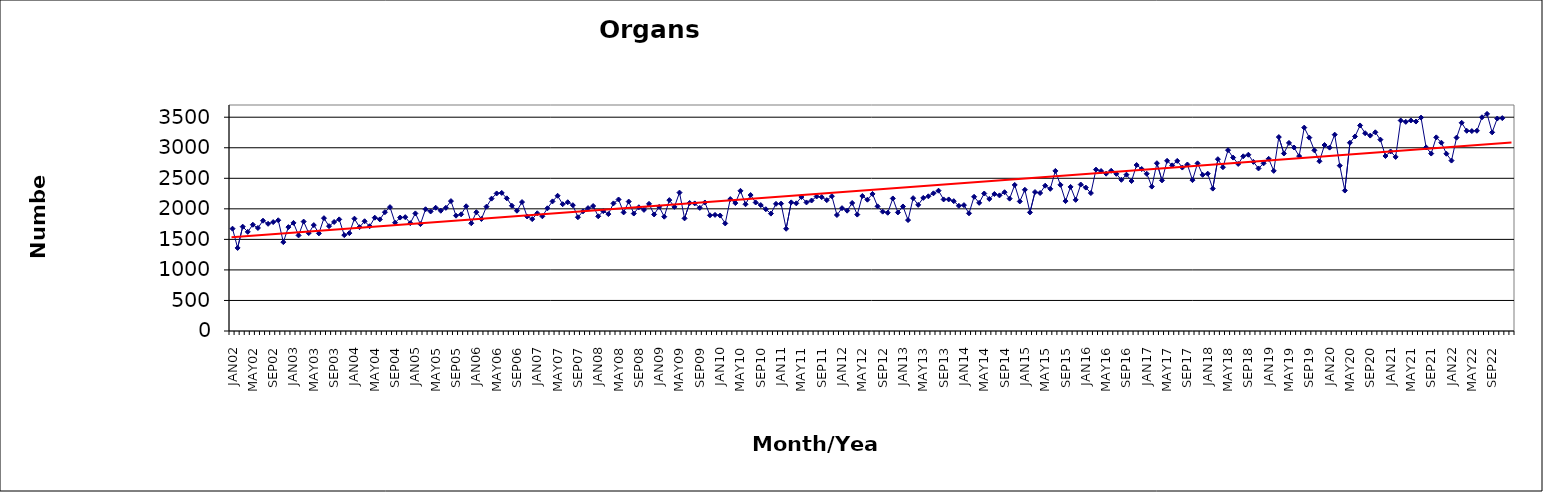
| Category | Series 0 |
|---|---|
| JAN02 | 1675 |
| FEB02 | 1360 |
| MAR02 | 1708 |
| APR02 | 1623 |
| MAY02 | 1740 |
| JUN02 | 1687 |
| JUL02 | 1806 |
| AUG02 | 1755 |
| SEP02 | 1783 |
| OCT02 | 1813 |
| NOV02 | 1455 |
| DEC02 | 1701 |
| JAN03 | 1770 |
| FEB03 | 1565 |
| MAR03 | 1791 |
| APR03 | 1603 |
| MAY03 | 1734 |
| JUN03 | 1598 |
| JUL03 | 1847 |
| AUG03 | 1716 |
| SEP03 | 1785 |
| OCT03 | 1827 |
| NOV03 | 1570 |
| DEC03 | 1602 |
| JAN04 | 1839 |
| FEB04 | 1700 |
| MAR04 | 1797 |
| APR04 | 1715 |
| MAY04 | 1855 |
| JUN04 | 1827 |
| JUL04 | 1945 |
| AUG04 | 2028 |
| SEP04 | 1773 |
| OCT04 | 1857 |
| NOV04 | 1864 |
| DEC04 | 1766 |
| JAN05 | 1925 |
| FEB05 | 1750 |
| MAR05 | 1993 |
| APR05 | 1957 |
| MAY05 | 2018 |
| JUN05 | 1969 |
| JUL05 | 2016 |
| AUG05 | 2127 |
| SEP05 | 1888 |
| OCT05 | 1910 |
| NOV05 | 2042 |
| DEC05 | 1764 |
| JAN06 | 1945 |
| FEB06 | 1834 |
| MAR06 | 2035 |
| APR06 | 2167 |
| MAY06 | 2252 |
| JUN06 | 2261 |
| JUL06 | 2172 |
| AUG06 | 2051 |
| SEP06 | 1969 |
| OCT06 | 2111 |
| NOV06 | 1875 |
| DEC06 | 1832 |
| JAN07 | 1927 |
| FEB07 | 1878 |
| MAR07 | 2009 |
| APR07 | 2122 |
| MAY07 | 2214 |
| JUN07 | 2076 |
| JUL07 | 2108 |
| AUG07 | 2060 |
| SEP07 | 1863 |
| OCT07 | 1959 |
| NOV07 | 2012 |
| DEC07 | 2046 |
| JAN08 | 1878 |
| FEB08 | 1962 |
| MAR08 | 1914 |
| APR08 | 2089 |
| MAY08 | 2153 |
| JUN08 | 1942 |
| JUL08 | 2119 |
| AUG08 | 1923 |
| SEP08 | 2026 |
| OCT08 | 1983 |
| NOV08 | 2082 |
| DEC08 | 1908 |
| JAN09 | 2033 |
| FEB09 | 1871 |
| MAR09 | 2143 |
| APR09 | 2032 |
| MAY09 | 2266 |
| JUN09 | 1844 |
| JUL09 | 2096 |
| AUG09 | 2089 |
| SEP09 | 2016 |
| OCT09 | 2104 |
| NOV09 | 1894 |
| DEC09 | 1901 |
| JAN10 | 1890 |
| FEB10 | 1761 |
| MAR10 | 2160 |
| APR10 | 2094 |
| MAY10 | 2295 |
| JUN10 | 2075 |
| JUL10 | 2226 |
| AUG10 | 2104 |
| SEP10 | 2062 |
| OCT10 | 1994 |
| NOV10 | 1922 |
| DEC10 | 2082 |
| JAN11 | 2085 |
| FEB11 | 1674 |
| MAR11 | 2106 |
| APR11 | 2090 |
| MAY11 | 2194 |
| JUN11 | 2105 |
| JUL11 | 2136 |
| AUG11 | 2202 |
| SEP11 | 2192 |
| OCT11 | 2142 |
| NOV11 | 2207 |
| DEC11 | 1899 |
| JAN12 | 2011 |
| FEB12 | 1970 |
| MAR12 | 2096 |
| APR12 | 1906 |
| MAY12 | 2210 |
| JUN12 | 2150 |
| JUL12 | 2244 |
| AUG12 | 2041 |
| SEP12 | 1954 |
| OCT12 | 1936 |
| NOV12 | 2170 |
| DEC12 | 1941 |
| JAN13 | 2039 |
| FEB13 | 1816 |
| MAR13 | 2175 |
| APR13 | 2065 |
| MAY13 | 2179 |
| JUN13 | 2205 |
| JUL13 | 2254 |
| AUG13 | 2297 |
| SEP13 | 2154 |
| OCT13 | 2154 |
| NOV13 | 2126 |
| DEC13 | 2049 |
| JAN14 | 2061 |
| FEB14 | 1927 |
| MAR14 | 2197 |
| APR14 | 2098 |
| MAY14 | 2251 |
| JUN14 | 2162 |
| JUL14 | 2243 |
| AUG14 | 2220 |
| SEP14 | 2272 |
| OCT14 | 2167 |
| NOV14 | 2391 |
| DEC14 | 2121 |
| JAN15 | 2312 |
| FEB15 | 1942 |
| MAR15 | 2275 |
| APR15 | 2259 |
| MAY15 | 2379 |
| JUN15 | 2328 |
| JUL15 | 2621 |
| AUG15 | 2393 |
| SEP15 | 2127 |
| OCT15 | 2359 |
| NOV15 | 2147 |
| DEC15 | 2398 |
| JAN16 | 2348 |
| FEB16 | 2258 |
| MAR16 | 2642 |
| APR16 | 2619 |
| MAY16 | 2576 |
| JUN16 | 2623 |
| JUL16 | 2573 |
| AUG16 | 2475 |
| SEP16 | 2559 |
| OCT16 | 2455 |
| NOV16 | 2717 |
| DEC16 | 2652 |
| JAN17 | 2574 |
| FEB17 | 2364 |
| MAR17 | 2747 |
| APR17 | 2466 |
| MAY17 | 2786 |
| JUN17 | 2712 |
| JUL17 | 2785 |
| AUG17 | 2676 |
| SEP17 | 2726 |
| OCT17 | 2470 |
| NOV17 | 2745 |
| DEC17 | 2557 |
| JAN18 | 2575 |
| FEB18 | 2331 |
| MAR18 | 2813 |
| APR18 | 2681 |
| MAY18 | 2960 |
| JUN18 | 2839 |
| JUL18 | 2735 |
| AUG18 | 2860 |
| SEP18 | 2886 |
| OCT18 | 2769 |
| NOV18 | 2661 |
| DEC18 | 2745 |
| JAN19 | 2819 |
| FEB19 | 2622 |
| MAR19 | 3175 |
| APR19 | 2906 |
| MAY19 | 3079 |
| JUN19 | 3004 |
| JUL19 | 2863 |
| AUG19 | 3330 |
| SEP19 | 3166 |
| OCT19 | 2958 |
| NOV19 | 2779 |
| DEC19 | 3045 |
| JAN20 | 3002 |
| FEB20 | 3214 |
| MAR20 | 2707 |
| APR20 | 2299 |
| MAY20 | 3082 |
| JUN20 | 3185 |
| JUL20 | 3365 |
| AUG20 | 3238 |
| SEP20 | 3199 |
| OCT20 | 3253 |
| NOV20 | 3133 |
| DEC20 | 2865 |
| JAN21 | 2939 |
| FEB21 | 2850 |
| MAR21 | 3446 |
| APR21 | 3424 |
| MAY21 | 3447 |
| JUN21 | 3429 |
| JUL21 | 3494 |
| AUG21 | 3006 |
| SEP21 | 2905 |
| OCT21 | 3170 |
| NOV21 | 3083 |
| DEC21 | 2902 |
| JAN22 | 2790 |
| FEB22 | 3166 |
| MAR22 | 3409 |
| APR22 | 3278 |
| MAY22 | 3273 |
| JUN22 | 3278 |
| JUL22 | 3499 |
| AUG22 | 3554 |
| SEP22 | 3252 |
| OCT22 | 3478 |
| NOV22 | 3485 |